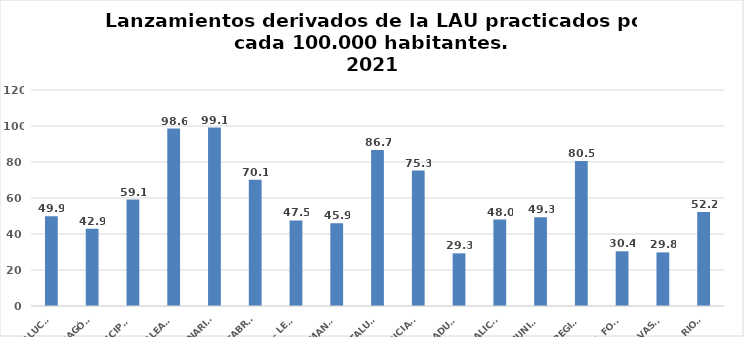
| Category | Series 0 |
|---|---|
| ANDALUCÍA | 49.93 |
| ARAGÓN | 42.903 |
| ASTURIAS, PRINCIPADO | 59.103 |
| ILLES BALEARS | 98.55 |
| CANARIAS | 99.128 |
| CANTABRIA | 70.145 |
| CASTILLA - LEÓN | 47.542 |
| CASTILLA - LA MANCHA | 45.912 |
| CATALUÑA | 86.676 |
| C. VALENCIANA | 75.265 |
| EXTREMADURA | 29.259 |
| GALICIA | 48.003 |
| MADRID, COMUNIDAD | 49.28 |
| MURCIA, REGIÓN | 80.541 |
| NAVARRA, COM. FORAL | 30.384 |
| PAÍS VASCO | 29.765 |
| LA RIOJA | 52.221 |